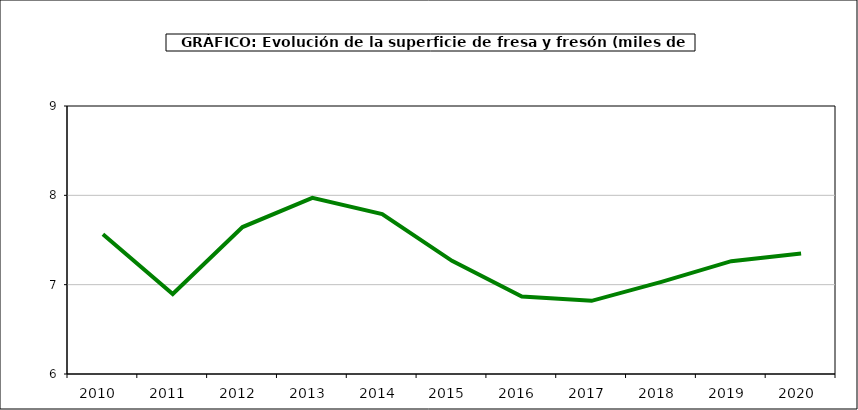
| Category | superficie |
|---|---|
| 2010.0 | 7.564 |
| 2011.0 | 6.896 |
| 2012.0 | 7.645 |
| 2013.0 | 7.972 |
| 2014.0 | 7.791 |
| 2015.0 | 7.267 |
| 2016.0 | 6.867 |
| 2017.0 | 6.819 |
| 2018.0 | 7.032 |
| 2019.0 | 7.263 |
| 2020.0 | 7.348 |